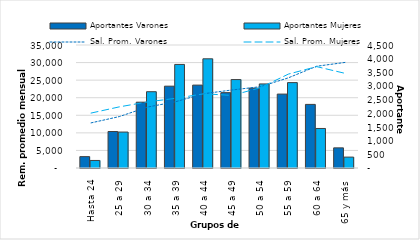
| Category | Aportantes Varones | Aportantes Mujeres |
|---|---|---|
| Hasta 24 | 416 | 276 |
| 25 a 29 | 1335 | 1315 |
| 30 a 34 | 2408 | 2791 |
| 35 a 39 | 2994 | 3789 |
| 40 a 44 | 3033 | 3995 |
| 45 a 49 | 2757 | 3235 |
| 50 a 54 | 2921 | 3076 |
| 55 a 59 | 2704 | 3124 |
| 60 a 64 | 2327 | 1446 |
| 65 y más | 737 | 399 |